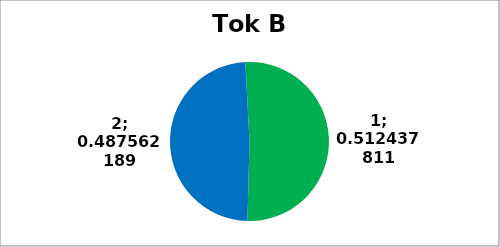
| Category | Series 0 |
|---|---|
| 0 | 103 |
| 1 | 98 |